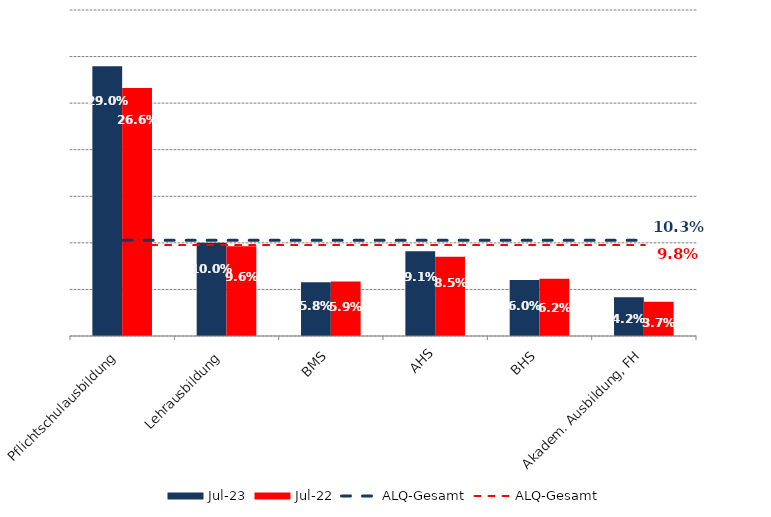
| Category | Jul 23 | Jul 22 |
|---|---|---|
| Pflichtschulausbildung | 0.29 | 0.266 |
| Lehrausbildung | 0.1 | 0.096 |
| BMS | 0.058 | 0.059 |
| AHS | 0.091 | 0.085 |
| BHS | 0.06 | 0.062 |
| Akadem. Ausbildung, FH | 0.042 | 0.037 |